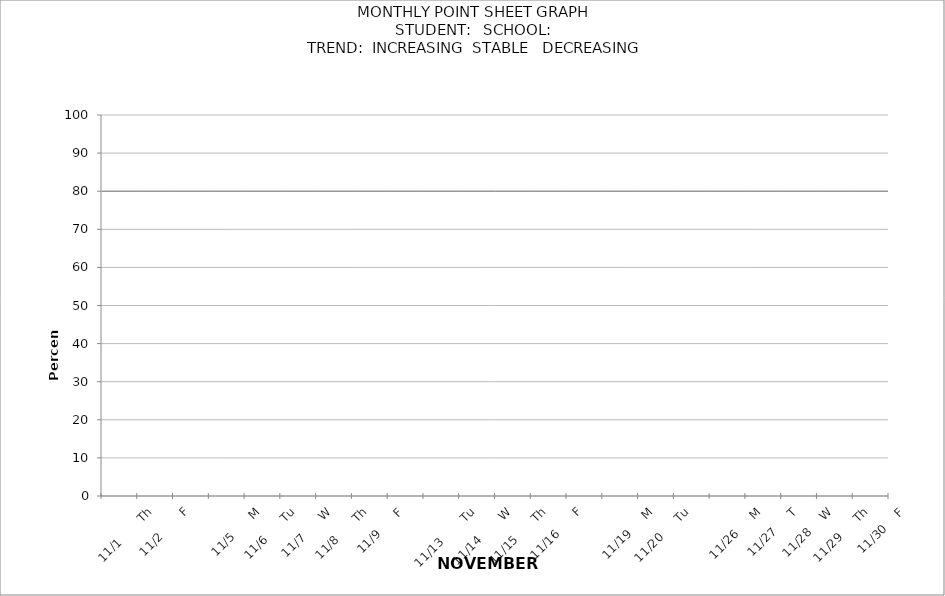
| Category | PERCENTAGE | target |
|---|---|---|
|  |  | 80 |
| 11/1       Th |  | 80 |
| 11/2       F |  | 80 |
|  |  | 80 |
| 11/5      M |  | 80 |
| 11/6      Tu |  | 80 |
| 11/7      W |  | 80 |
| 11/8      Th |  | 80 |
| 11/9      F |  | 80 |
|  |  | 80 |
| 11/13       Tu |  | 80 |
| 11/14       W |  | 80 |
| 11/15      Th |  | 80 |
| 11/16      F |  | 80 |
|  |  | 80 |
| 11/19     M |  | 80 |
| 11/20     Tu |  | 80 |
|  |  | 80 |
| 11/26     M |  | 80 |
| 11/27     T |  | 80 |
| 11/28    W |  | 80 |
| 11/29     Th |  | 80 |
| 11/30    F |  | 80 |